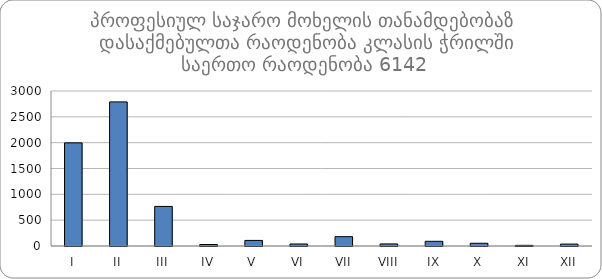
| Category | ჯამი |
|---|---|
| I | 1996 |
| II | 2789 |
| III | 766 |
| IV | 29 |
| V | 108 |
| VI | 39 |
| VII | 181 |
| VIII | 40 |
| IX | 91 |
| X | 53 |
| XI | 13 |
| XII | 37 |